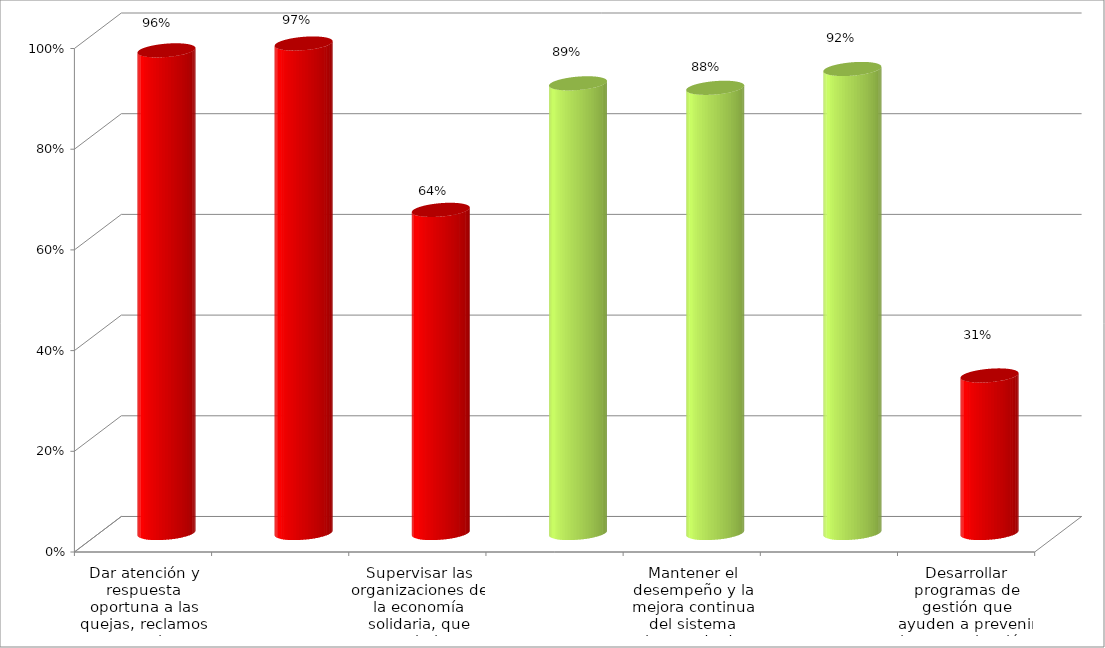
| Category | Series 0 |
|---|---|
| Dar atención y respuesta oportuna a las quejas, reclamos y consultas, formuladas por la ciudadania. | 0.959 |
| Formular, desarrollar y ejecutar, oportunamente, los proyectos de inversión de la entidad. | 0.972 |
| Supervisar las organizaciones de la economía solidaria, que estan bajo su competencia. | 0.642 |
| Mejorar los canales internos y externos de comunicación de la entidad. | 0.893 |
| Mantener el desempeño y la mejora continua del sistema integrado de gestión  | 0.884 |
| Mejorar la calidad del servicio y el medio ambiente fortaleciendo el Talento Humano. | 0.922 |
| Desarrollar programas de gestión que ayuden a prevenir la contaminación, a reducir y controlar los aspectos e impactos ambientales identificados | 0.313 |